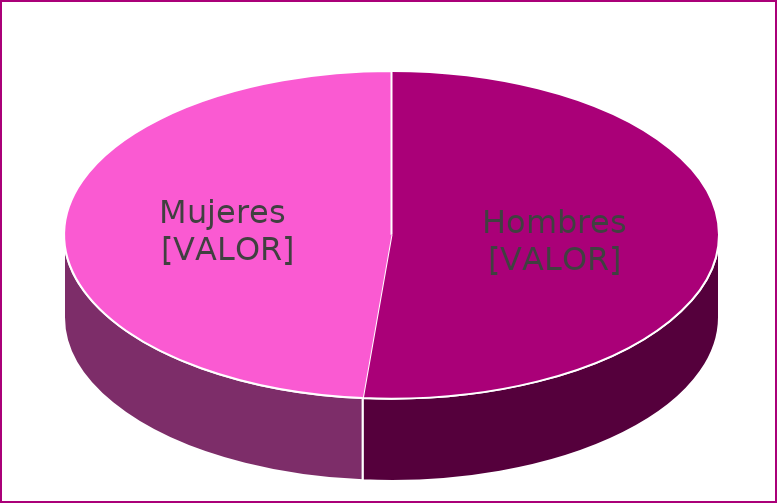
| Category | % |
|---|---|
| Hombres | 0.514 |
| Mujeres | 0.486 |